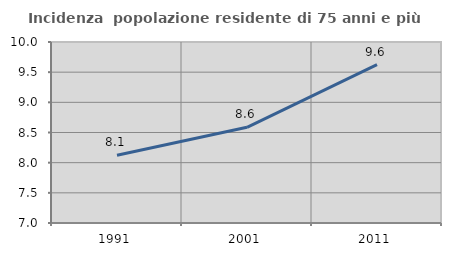
| Category | Incidenza  popolazione residente di 75 anni e più |
|---|---|
| 1991.0 | 8.123 |
| 2001.0 | 8.587 |
| 2011.0 | 9.625 |